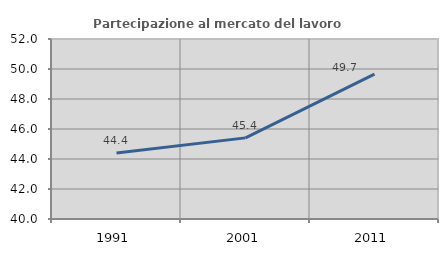
| Category | Partecipazione al mercato del lavoro  femminile |
|---|---|
| 1991.0 | 44.398 |
| 2001.0 | 45.409 |
| 2011.0 | 49.664 |